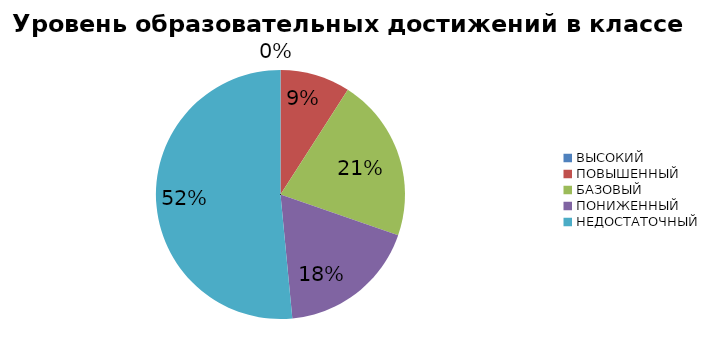
| Category | Series 0 |
|---|---|
| ВЫСОКИЙ | 0 |
| ПОВЫШЕННЫЙ | 9.091 |
| БАЗОВЫЙ | 21.212 |
| ПОНИЖЕННЫЙ | 18.182 |
| НЕДОСТАТОЧНЫЙ | 51.515 |